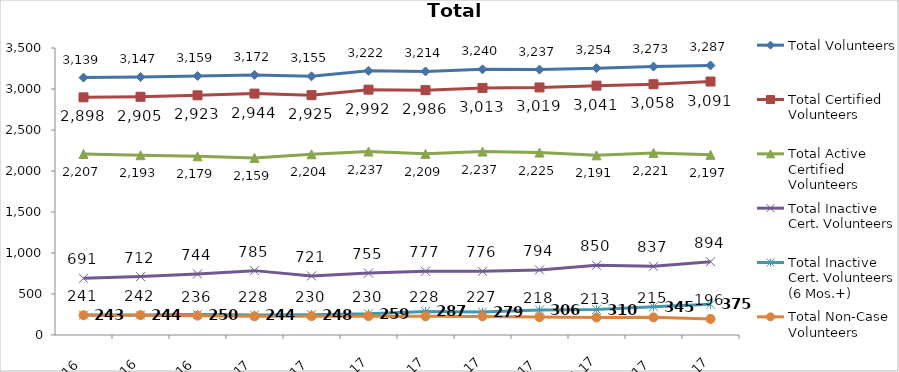
| Category | Total Volunteers | Total Certified Volunteers | Total Active Certified Volunteers | Total Inactive Cert. Volunteers | Total Inactive Cert. Volunteers (6 Mos.+) | Total Non-Case Volunteers |
|---|---|---|---|---|---|---|
| 2016-10-01 | 3139 | 2898 | 2207 | 691 | 243 | 241 |
| 2016-11-01 | 3147 | 2905 | 2193 | 712 | 244 | 242 |
| 2016-12-01 | 3159 | 2923 | 2179 | 744 | 250 | 236 |
| 2017-01-01 | 3172 | 2944 | 2159 | 785 | 244 | 228 |
| 2017-02-01 | 3155 | 2925 | 2204 | 721 | 248 | 230 |
| 2017-03-01 | 3222 | 2992 | 2237 | 755 | 259 | 230 |
| 2017-04-01 | 3214 | 2986 | 2209 | 777 | 287 | 228 |
| 2017-05-01 | 3240 | 3013 | 2237 | 776 | 279 | 227 |
| 2017-06-01 | 3237 | 3019 | 2225 | 794 | 306 | 218 |
| 2017-07-01 | 3254 | 3041 | 2191 | 850 | 310 | 213 |
| 2017-08-01 | 3273 | 3058 | 2221 | 837 | 345 | 215 |
| 2017-09-01 | 3287 | 3091 | 2197 | 894 | 375 | 196 |